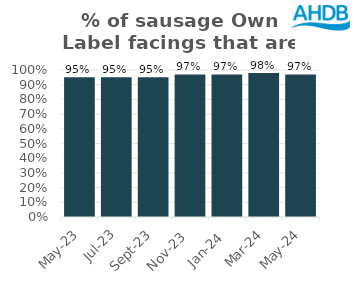
| Category | Sausage |
|---|---|
| 2023-05-01 | 0.95 |
| 2023-07-01 | 0.95 |
| 2023-09-01 | 0.95 |
| 2023-11-01 | 0.97 |
| 2024-01-01 | 0.97 |
| 2024-03-01 | 0.98 |
| 2024-05-01 | 0.97 |